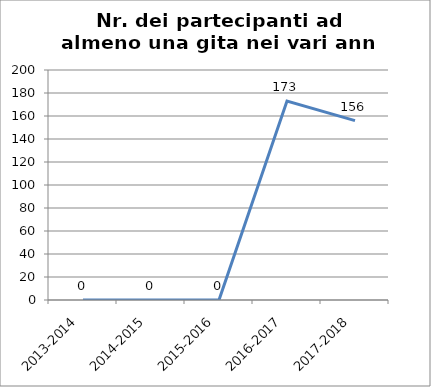
| Category | Nr. Partecipanti ad almeno una Gita |
|---|---|
| 2013-2014 | 0 |
| 2014-2015 | 0 |
| 2015-2016 | 0 |
| 2016-2017 | 173 |
| 2017-2018 | 156 |